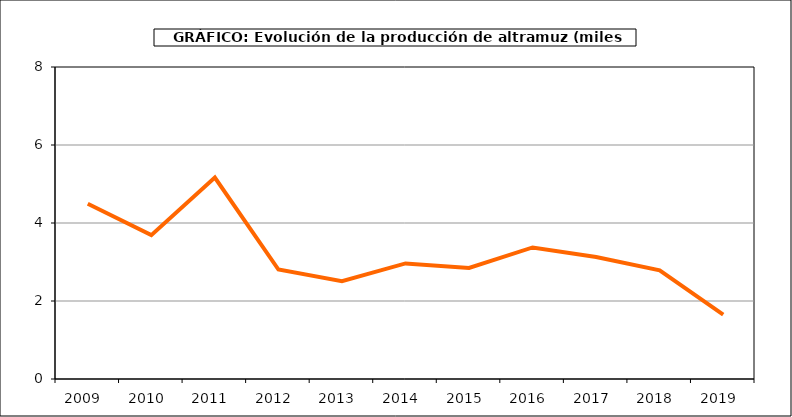
| Category | Producción |
|---|---|
| 2009.0 | 4.492 |
| 2010.0 | 3.689 |
| 2011.0 | 5.166 |
| 2012.0 | 2.807 |
| 2013.0 | 2.508 |
| 2014.0 | 2.963 |
| 2015.0 | 2.847 |
| 2016.0 | 3.373 |
| 2017.0 | 3.127 |
| 2018.0 | 2.786 |
| 2019.0 | 1.653 |